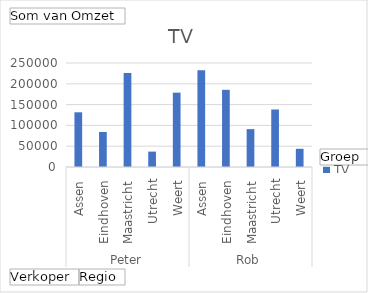
| Category | TV |
|---|---|
| 0 | 131500 |
| 1 | 84250 |
| 2 | 226000 |
| 3 | 37000 |
| 4 | 178750 |
| 5 | 232750 |
| 6 | 185500 |
| 7 | 91000 |
| 8 | 138250 |
| 9 | 43750 |